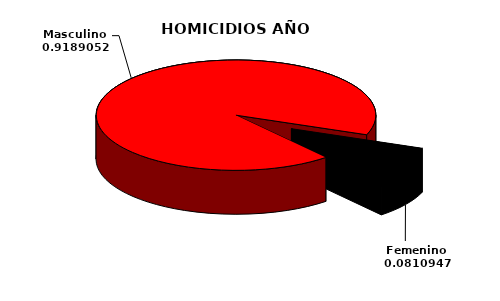
| Category | 2013 |
|---|---|
| Masculino | 1813 |
| Femenino | 160 |